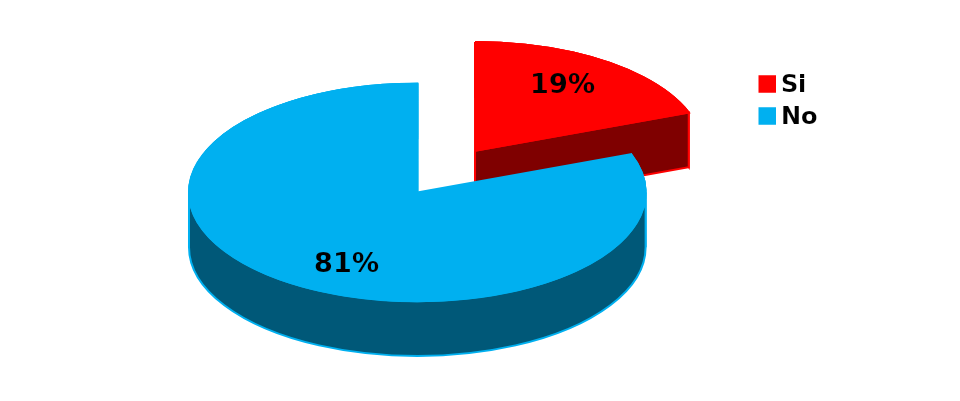
| Category | Series 0 |
|---|---|
| Si | 16 |
| No | 67 |